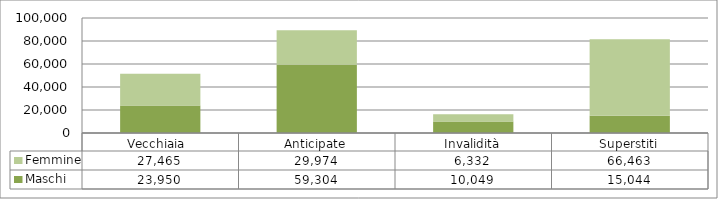
| Category | Maschi | Femmine |
|---|---|---|
| Vecchiaia  | 23950 | 27465 |
| Anticipate | 59304 | 29974 |
| Invalidità | 10049 | 6332 |
| Superstiti | 15044 | 66463 |